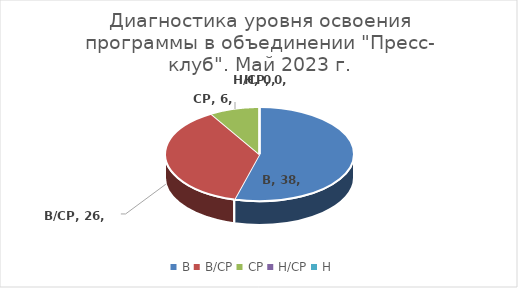
| Category | Series 0 |
|---|---|
| В | 38 |
| В/СР | 26 |
| СР | 6 |
| Н/СР | 0 |
| Н | 0 |